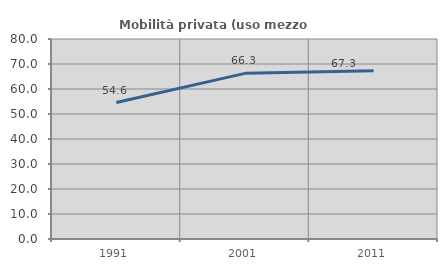
| Category | Mobilità privata (uso mezzo privato) |
|---|---|
| 1991.0 | 54.583 |
| 2001.0 | 66.259 |
| 2011.0 | 67.323 |